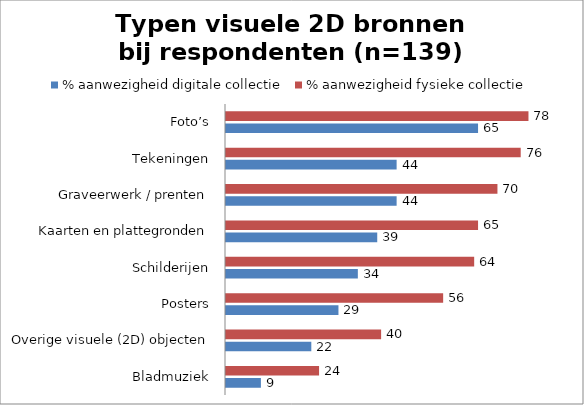
| Category | % aanwezigheid digitale collectie | % aanwezigheid fysieke collectie |
|---|---|---|
| Bladmuziek | 9 | 24 |
| Overige visuele (2D) objecten | 22 | 40 |
| Posters | 29 | 56 |
| Schilderijen | 34 | 64 |
| Kaarten en plattegronden | 39 | 65 |
| Graveerwerk / prenten | 44 | 70 |
| Tekeningen | 44 | 76 |
| Foto’s | 65 | 78 |